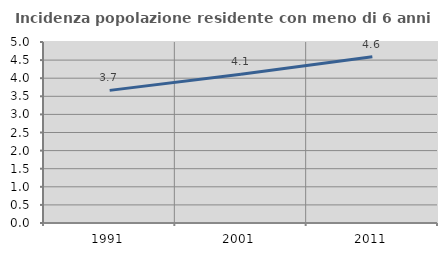
| Category | Incidenza popolazione residente con meno di 6 anni |
|---|---|
| 1991.0 | 3.664 |
| 2001.0 | 4.107 |
| 2011.0 | 4.593 |